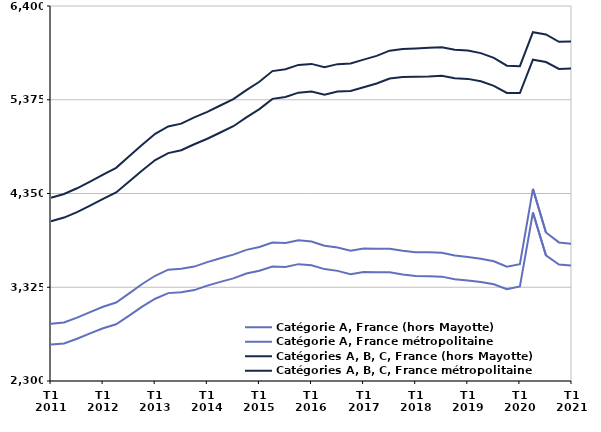
| Category | Catégorie A, France (hors Mayotte) | Catégorie A, France métropolitaine | Catégories A, B, C, France (hors Mayotte) | Catégories A, B, C, France métropolitaine |
|---|---|---|---|---|
| T1
2011 | 2924.8 | 2698.6 | 4302.9 | 4047.5 |
| T2
2011 | 2939 | 2710.3 | 4345.1 | 4086.7 |
| T3
2011 | 2992.2 | 2761.8 | 4407 | 4146.5 |
| T4
2011 | 3053.8 | 2821.4 | 4480.5 | 4217.6 |
| T1
2012 | 3111.4 | 2876.4 | 4556.5 | 4290.3 |
| T2
2012 | 3158.4 | 2920.8 | 4630.7 | 4360.7 |
| T3
2012 | 3257.4 | 3015.3 | 4756.3 | 4480.8 |
| T4
2012 | 3360.9 | 3113 | 4883 | 4600.9 |
| T1
2013 | 3450.6 | 3199.2 | 5002.2 | 4716.3 |
| T2
2013 | 3516.7 | 3260.9 | 5082.7 | 4791.9 |
| T3
2013 | 3526.2 | 3270.1 | 5114 | 4822.9 |
| T4
2013 | 3550.8 | 3293.8 | 5181.5 | 4888.7 |
| T1
2014 | 3599.5 | 3343 | 5242 | 4948.8 |
| T2
2014 | 3641.9 | 3383.7 | 5312.3 | 5017.1 |
| T3
2014 | 3681.3 | 3422.1 | 5382.6 | 5085.7 |
| T4
2014 | 3734 | 3474.8 | 5480.7 | 5182.8 |
| T1
2015 | 3766 | 3506.1 | 5571.7 | 5272.2 |
| T2
2015 | 3812.9 | 3550.5 | 5688.4 | 5384.8 |
| T3
2015 | 3808.8 | 3546.7 | 5709 | 5404.8 |
| T4
2015 | 3838.1 | 3577.7 | 5755.8 | 5452.5 |
| T1
2016 | 3825.3 | 3565.5 | 5767.1 | 5464 |
| T2
2016 | 3779.3 | 3523.3 | 5730 | 5430.7 |
| T3
2016 | 3759.7 | 3504 | 5764.3 | 5464.3 |
| T4
2016 | 3724.6 | 3468.4 | 5771.7 | 5470.4 |
| T1
2017 | 3749.2 | 3492.3 | 5813.4 | 5511.3 |
| T2
2017 | 3744.8 | 3488.6 | 5855.1 | 5552.5 |
| T3
2017 | 3746.9 | 3489.6 | 5911.8 | 5606.6 |
| T4
2017 | 3723 | 3464 | 5931 | 5622.8 |
| T1
2018 | 3708.6 | 3448.7 | 5936.5 | 5626.6 |
| T2
2018 | 3706.6 | 3445.4 | 5942.3 | 5629.4 |
| T3
2018 | 3702 | 3441.1 | 5949.2 | 5636.1 |
| T4
2018 | 3671.2 | 3412.7 | 5922.2 | 5610.7 |
| T1
2019 | 3654.9 | 3397.5 | 5914.3 | 5603.1 |
| T2
2019 | 3636.3 | 3381.2 | 5884.6 | 5576.3 |
| T3
2019 | 3609.2 | 3357.3 | 5832.2 | 5527.4 |
| T4
2019 | 3549.3 | 3303.9 | 5747.1 | 5449.2 |
| T1
2020 | 3576.6 | 3334.2 | 5742 | 5448.2 |
| T2
2020 | 4400.8 | 4142.7 | 6113.9 | 5813.3 |
| T3
2020 | 3923.9 | 3673.2 | 6089.3 | 5787.1 |
| T4
2020 | 3815.2 | 3572.8 | 6008.4 | 5712.2 |
| T1
2021 | 3800.7 | 3560.6 | 6012.6 | 5716.9 |